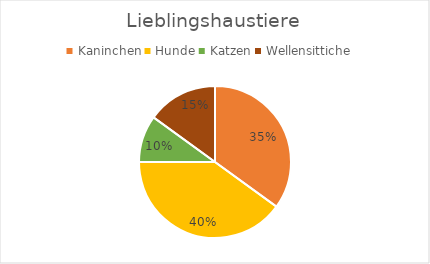
| Category | Series 0 |
|---|---|
| Kaninchen | 7 |
| Hunde | 8 |
| Katzen | 2 |
| Wellensittiche | 3 |